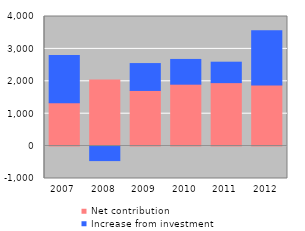
| Category | Net contribution | Increase from investment |
|---|---|---|
| 2007 | 1341.63 | 1454.766 |
| 2008 | 2042.43 | -447.447 |
| 2009 | 1717.6 | 829.983 |
| 2010 | 1910.9 | 763.643 |
| 2011 | 1958.9 | 630.702 |
| 2012 | 1883.66 | 1675.325 |